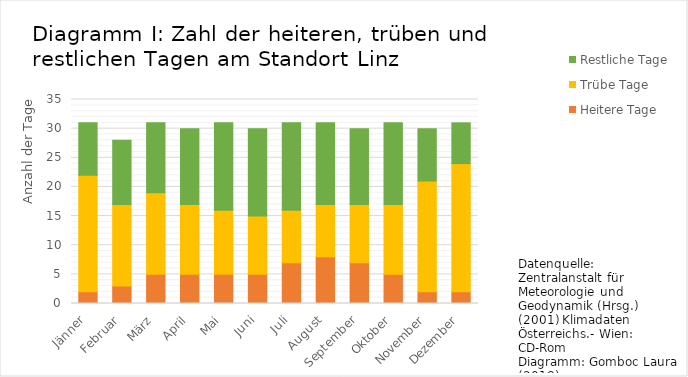
| Category | Heitere Tage | Trübe Tage | Restliche Tage |
|---|---|---|---|
| Jänner | 2 | 20 | 9 |
| Februar | 3 | 14 | 11 |
| März | 5 | 14 | 12 |
| April | 5 | 12 | 13 |
| Mai | 5 | 11 | 15 |
| Juni | 5 | 10 | 15 |
| Juli | 7 | 9 | 15 |
| August | 8 | 9 | 14 |
| September | 7 | 10 | 13 |
| Oktober | 5 | 12 | 14 |
| November | 2 | 19 | 9 |
| Dezember | 2 | 22 | 7 |